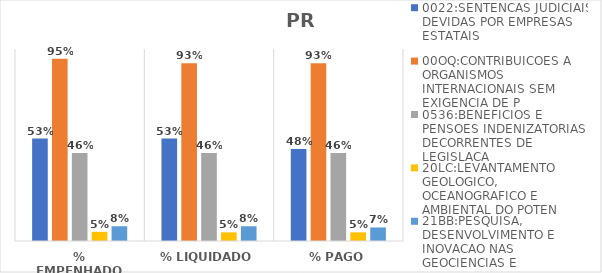
| Category | 0022:SENTENCAS JUDICIAIS DEVIDAS POR EMPRESAS ESTATAIS | 00OQ:CONTRIBUICOES A ORGANISMOS INTERNACIONAIS SEM EXIGENCIA DE P | 0536:BENEFICIOS E PENSOES INDENIZATORIAS DECORRENTES DE LEGISLACA | 20LC:LEVANTAMENTO GEOLOGICO, OCEANOGRAFICO E AMBIENTAL DO POTEN | 21BB:PESQUISA, DESENVOLVIMENTO E INOVACAO NAS GEOCIENCIAS E |
|---|---|---|---|---|---|
| % EMPENHADO | 0.533 | 0.95 | 0.459 | 0.048 | 0.077 |
| % LIQUIDADO | 0.533 | 0.926 | 0.459 | 0.045 | 0.077 |
| % PAGO | 0.479 | 0.926 | 0.459 | 0.045 | 0.07 |